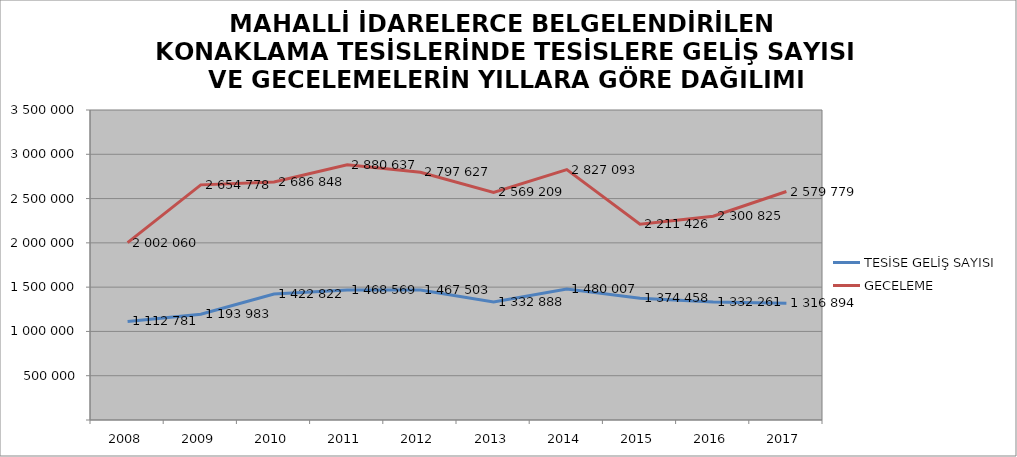
| Category | TESİSE GELİŞ SAYISI | GECELEME |
|---|---|---|
| 2008 | 1112781 | 2002060 |
| 2009 | 1193983 | 2654778 |
| 2010 | 1422822 | 2686848 |
| 2011 | 1468569 | 2880637 |
| 2012 | 1467503 | 2797627 |
| 2013 | 1332888 | 2569209 |
| 2014 | 1480007 | 2827093 |
| 2015 | 1374458 | 2211426 |
| 2016 | 1332261 | 2300825 |
| 2017 | 1316894 | 2579779 |